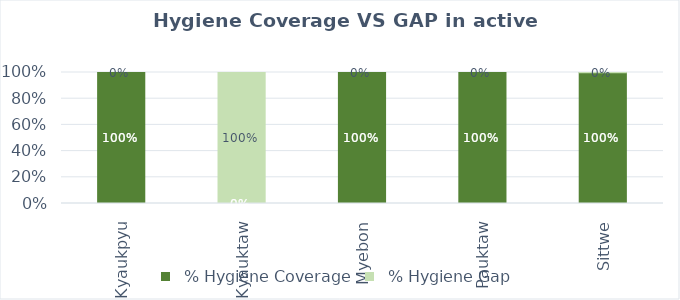
| Category |   % Hygiene Coverage |   % Hygiene Gap |
|---|---|---|
| Kyaukpyu | 1 | 0 |
| Kyauktaw | 0 | 1 |
| Myebon | 1 | 0 |
| Pauktaw | 1 | 0 |
| Sittwe | 0.998 | 0.002 |